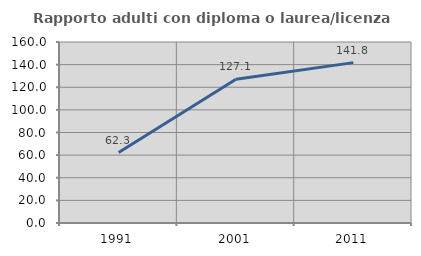
| Category | Rapporto adulti con diploma o laurea/licenza media  |
|---|---|
| 1991.0 | 62.319 |
| 2001.0 | 127.083 |
| 2011.0 | 141.781 |